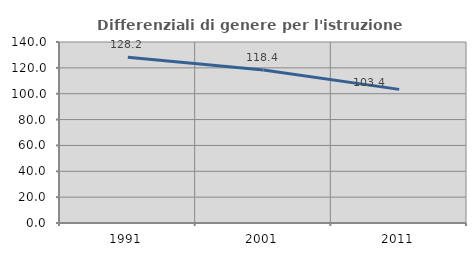
| Category | Differenziali di genere per l'istruzione superiore |
|---|---|
| 1991.0 | 128.174 |
| 2001.0 | 118.384 |
| 2011.0 | 103.362 |